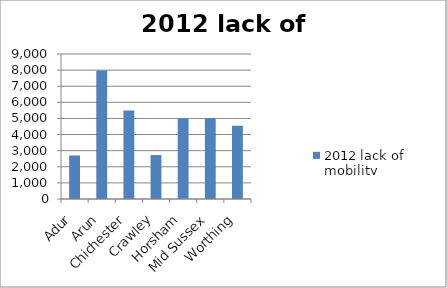
| Category | 2012 lack of mobility |
|---|---|
| Adur  | 2701 |
| Arun | 7973 |
| Chichester | 5497 |
| Crawley | 2726 |
| Horsham | 4996 |
| Mid Sussex | 5010 |
| Worthing | 4546 |